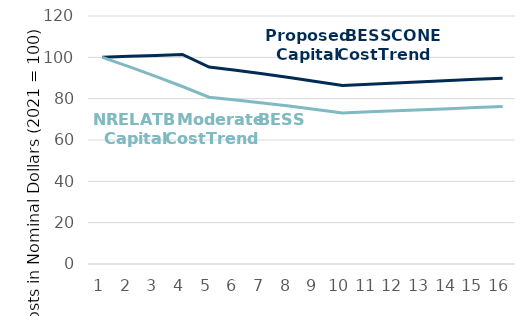
| Category | Series 0 | Series 1 |
|---|---|---|
| 0 | 100 | 100 |
| 1 | 100.47 | 95.517 |
| 2 | 100.942 | 90.815 |
| 3 | 101.417 | 85.886 |
| 4 | 95.321 | 80.724 |
| 5 | 93.732 | 79.378 |
| 6 | 92.041 | 77.946 |
| 7 | 90.245 | 76.425 |
| 8 | 88.341 | 74.813 |
| 9 | 86.324 | 73.105 |
| 10 | 86.95 | 73.635 |
| 11 | 87.566 | 74.157 |
| 12 | 88.173 | 74.67 |
| 13 | 88.768 | 75.174 |
| 14 | 89.352 | 75.669 |
| 15 | 89.924 | 76.153 |